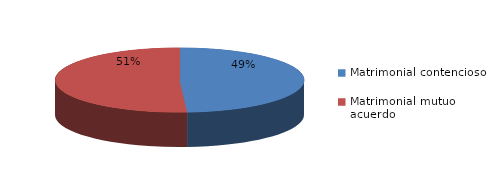
| Category | Series 0 |
|---|---|
| 0 | 253 |
| 1 | 263 |